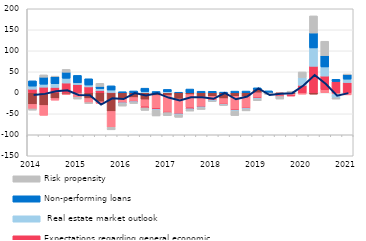
| Category | Costs of funding | Competition from other banks | Expectations regarding general economic situation |  Real estate market outlook | Non-performing loans  | Risk propensity |
|---|---|---|---|---|---|---|
| 2014.0 | -27.614 | -10.883 | 8.513 | 7.366 | 12.572 | -2.931 |
| nan | -30.154 | -23.565 | 13.381 | 6.958 | 16.79 | 5.591 |
| nan | -13.58 | -4.04 | 12.84 | 8.698 | 16.68 | 1.322 |
| nan | -3.194 | -0.943 | 23.215 | 11.346 | 14.413 | 6.815 |
| 2015.0 | 1.584 | -10.634 | 17.798 | 4.391 | 17.665 | -4.309 |
| nan | -13.709 | -9.748 | 14.011 | 4.433 | 14.906 | -2.291 |
| nan | -21.32 | -4.036 | 5.521 | 4.364 | 5.262 | 7.435 |
| nan | -44.371 | -37.787 | 0.672 | 5.886 | 9.984 | -6.068 |
| 2016.0 | -13.683 | -9.865 | -0.183 | -2.017 | 2.537 | -5.896 |
| nan | -11.339 | -9.602 | -0.197 | -1.974 | 4.34 | -2.332 |
| nan | -16.54 | -16.708 | -2.652 | 2.885 | 8.061 | -6.073 |
| nan | -6.439 | -30.804 | -2.596 | -1.957 | 3.101 | -13.396 |
| 2017.0 | -6.563 | -40.484 | -0.096 | 2.394 | 5.669 | -7.434 |
| nan | -14.708 | -34.121 | -1.211 | -2.234 | 1.309 | -6.144 |
| nan | -4.365 | -31.359 | -2.483 | -2.033 | 8.902 | -3.307 |
| nan | -9.63 | -23.589 | -0.294 | -2.083 | 3.686 | -4.267 |
| 2018.0 | -8.401 | -9.465 | -0.308 | -2.087 | 3.545 | -0.758 |
| nan | -13.817 | -13.719 | -0.384 | -1.143 | 1.627 | -1.188 |
| nan | -8.391 | -32.723 | -0.405 | -2.001 | 3.96 | -10.656 |
| nan | -8.386 | -28.581 | -0.415 | -2.043 | 4.097 | -3.682 |
| 2019.0 | 7.614 | -12.529 | -0.41 | -2.062 | 4.174 | -3.764 |
| nan | -0.003 | 0 | -0.494 | 0 | 4.55 | -3.594 |
| nan | -3.529 | -4.583 | -0.546 | 0 | 0 | -6.275 |
| nan | -3.387 | -3.387 | -0.556 | 0 | 0 | 3.746 |
| 2020.0 | 0 | -3.3 | 17.776 | 18.324 | 0 | 13.5 |
| nan | -3.3 | 0 | 63.053 | 43.711 | 35.524 | 40.8 |
| nan | 0 | 7.2 | 32.599 | 21.695 | 27.071 | 34.2 |
| nan | -0.778 | -3.063 | 26.746 | -8.12 | 5.298 | -3.047 |
| 2021.0 | 0 | -5.032 | 24.468 | 7.975 | 11.008 | 0.658 |